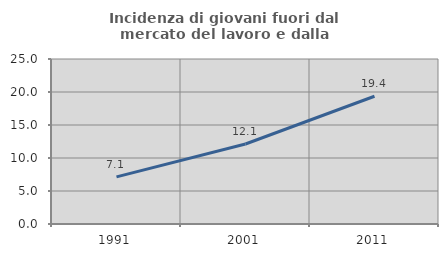
| Category | Incidenza di giovani fuori dal mercato del lavoro e dalla formazione  |
|---|---|
| 1991.0 | 7.143 |
| 2001.0 | 12.121 |
| 2011.0 | 19.355 |